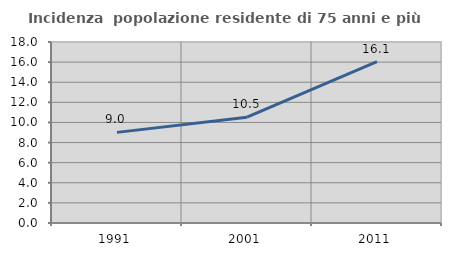
| Category | Incidenza  popolazione residente di 75 anni e più |
|---|---|
| 1991.0 | 9.012 |
| 2001.0 | 10.521 |
| 2011.0 | 16.059 |